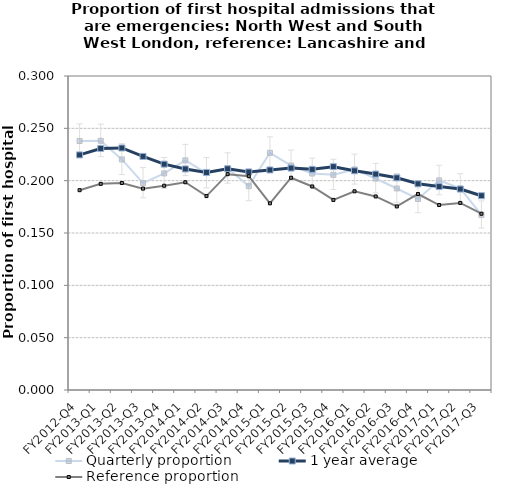
| Category | Quarterly proportion | 1 year average | Reference proportion |
|---|---|---|---|
| FY2012-Q4 | 0.238 | 0.225 | 0.191 |
| FY2013-Q1 | 0.238 | 0.231 | 0.197 |
| FY2013-Q2 | 0.22 | 0.231 | 0.198 |
| FY2013-Q3 | 0.198 | 0.223 | 0.192 |
| FY2013-Q4 | 0.207 | 0.216 | 0.195 |
| FY2014-Q1 | 0.219 | 0.211 | 0.198 |
| FY2014-Q2 | 0.207 | 0.208 | 0.185 |
| FY2014-Q3 | 0.212 | 0.211 | 0.206 |
| FY2014-Q4 | 0.195 | 0.208 | 0.204 |
| FY2015-Q1 | 0.227 | 0.21 | 0.178 |
| FY2015-Q2 | 0.214 | 0.212 | 0.203 |
| FY2015-Q3 | 0.207 | 0.211 | 0.194 |
| FY2015-Q4 | 0.206 | 0.213 | 0.182 |
| FY2016-Q1 | 0.211 | 0.209 | 0.19 |
| FY2016-Q2 | 0.202 | 0.206 | 0.185 |
| FY2016-Q3 | 0.193 | 0.203 | 0.175 |
| FY2016-Q4 | 0.183 | 0.197 | 0.187 |
| FY2017-Q1 | 0.2 | 0.194 | 0.177 |
| FY2017-Q2 | 0.193 | 0.192 | 0.179 |
| FY2017-Q3 | 0.167 | 0.186 | 0.168 |